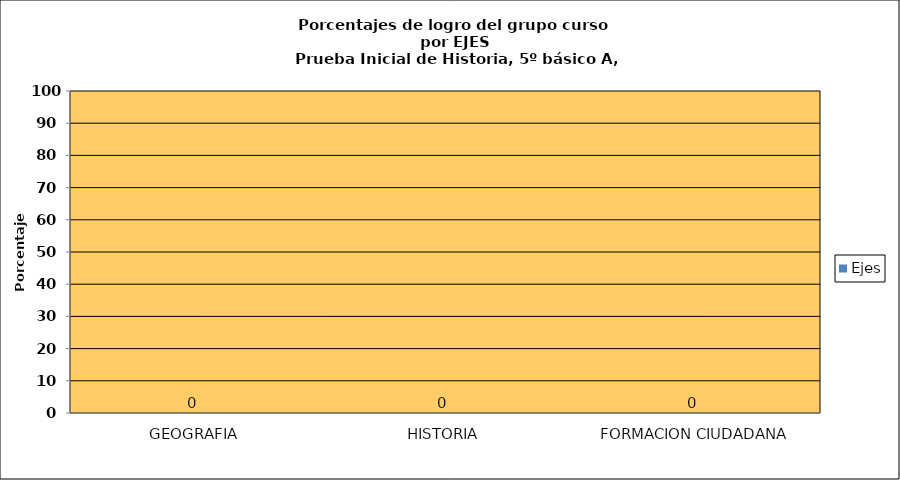
| Category | Ejes |
|---|---|
| GEOGRAFIA | 0 |
| HISTORIA | 0 |
| FORMACION CIUDADANA | 0 |